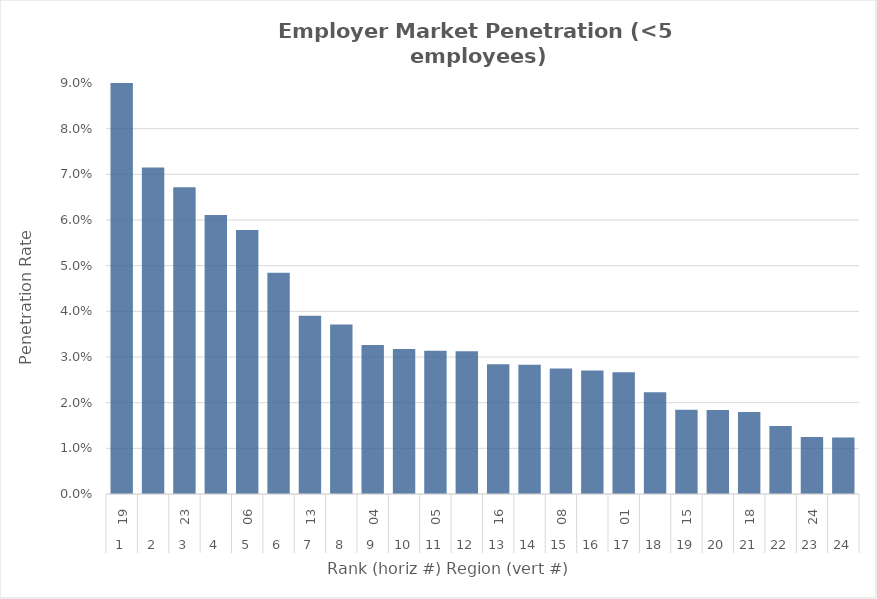
| Category | Rate |
|---|---|
| 0 | 0.09 |
| 1 | 0.071 |
| 2 | 0.067 |
| 3 | 0.061 |
| 4 | 0.058 |
| 5 | 0.048 |
| 6 | 0.039 |
| 7 | 0.037 |
| 8 | 0.033 |
| 9 | 0.032 |
| 10 | 0.031 |
| 11 | 0.031 |
| 12 | 0.028 |
| 13 | 0.028 |
| 14 | 0.027 |
| 15 | 0.027 |
| 16 | 0.027 |
| 17 | 0.022 |
| 18 | 0.018 |
| 19 | 0.018 |
| 20 | 0.018 |
| 21 | 0.015 |
| 22 | 0.012 |
| 23 | 0.012 |